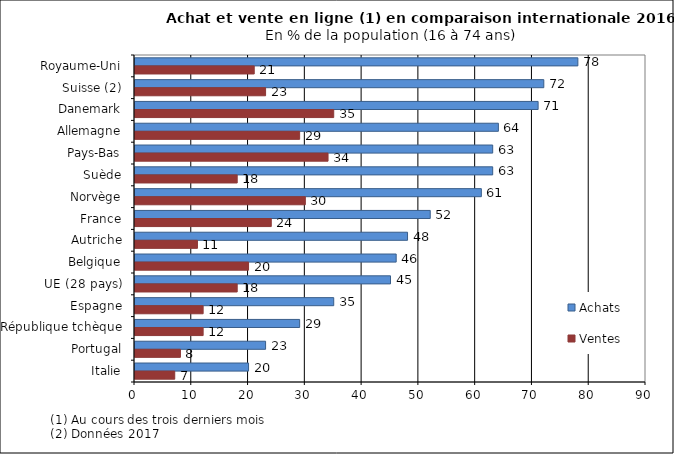
| Category | Achats | Ventes |
|---|---|---|
| Royaume-Uni | 78 | 21 |
| Suisse (2) | 72 | 23 |
| Danemark | 71 | 35 |
| Allemagne | 64 | 29 |
| Pays-Bas | 63 | 34 |
| Suède | 63 | 18 |
| Norvège | 61 | 30 |
| France | 52 | 24 |
| Autriche | 48 | 11 |
| Belgique | 46 | 20 |
| UE (28 pays) | 45 | 18 |
| Espagne | 35 | 12 |
| République tchèque | 29 | 12 |
| Portugal | 23 | 8 |
| Italie | 20 | 7 |